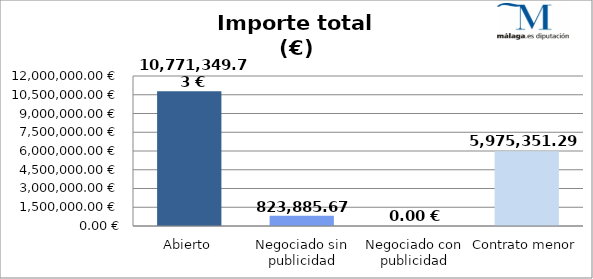
| Category | Importe total |
|---|---|
| Abierto | 10771349.73 |
| Negociado sin publicidad | 823885.67 |
| Negociado con publicidad | 0 |
| Contrato menor | 5975351.29 |